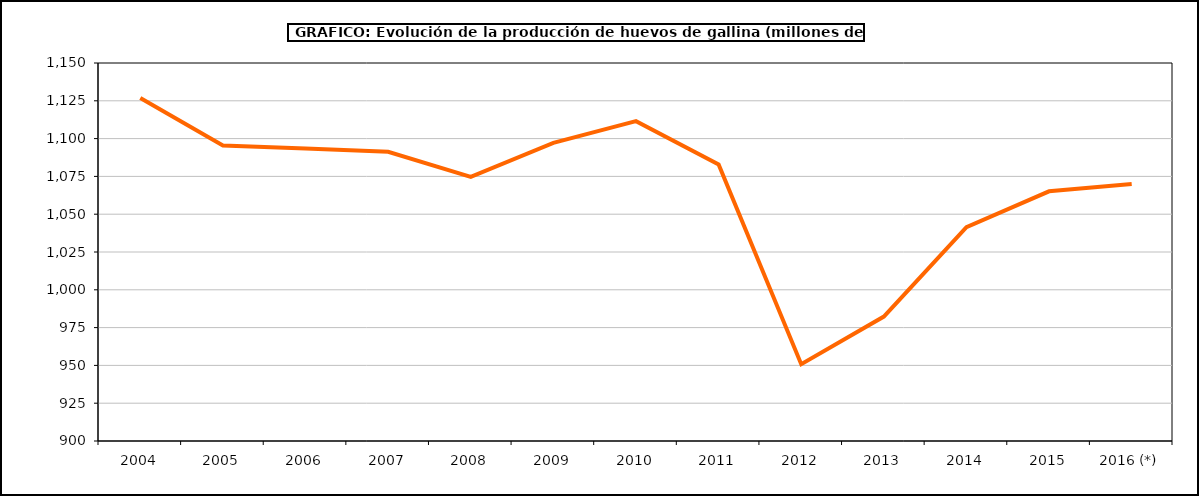
| Category | huevos gallina |
|---|---|
| 2004 | 1126.913 |
| 2005 | 1095.445 |
| 2006 | 1093.512 |
| 2007 | 1091.274 |
| 2008 | 1074.66 |
| 2009 | 1097.178 |
| 2010 | 1111.55 |
| 2011 | 1082.947 |
| 2012 | 950.76 |
| 2013 | 982.284 |
| 2014 | 1041.475 |
| 2015 | 1065.149 |
| 2016 (*) | 1070 |